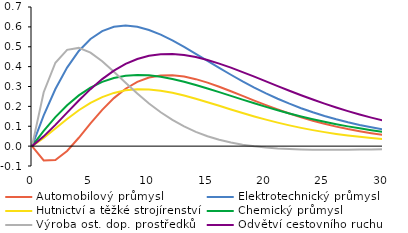
| Category | Automobilový průmysl | Elektrotechnický průmysl | Hutnictví a těžké strojírenství | Chemický průmysl | Výroba ost. dop. prostředků | Odvětví cestovního ruchu |
|---|---|---|---|---|---|---|
| 0.0 | 0 | 0 | 0 | 0 | 0 | 0 |
| 1.0 | -0.072 | 0.155 | 0.041 | 0.077 | 0.271 | 0.049 |
| 2.0 | -0.069 | 0.287 | 0.089 | 0.146 | 0.42 | 0.107 |
| 3.0 | -0.024 | 0.395 | 0.137 | 0.206 | 0.484 | 0.169 |
| 4.0 | 0.042 | 0.479 | 0.18 | 0.255 | 0.494 | 0.23 |
| 5.0 | 0.114 | 0.539 | 0.218 | 0.294 | 0.47 | 0.287 |
| 6.0 | 0.182 | 0.579 | 0.247 | 0.323 | 0.427 | 0.337 |
| 7.0 | 0.242 | 0.601 | 0.268 | 0.343 | 0.374 | 0.38 |
| 8.0 | 0.289 | 0.607 | 0.281 | 0.354 | 0.318 | 0.414 |
| 9.0 | 0.323 | 0.601 | 0.286 | 0.358 | 0.265 | 0.438 |
| 10.0 | 0.345 | 0.584 | 0.285 | 0.356 | 0.215 | 0.455 |
| 11.0 | 0.356 | 0.561 | 0.279 | 0.349 | 0.17 | 0.463 |
| 12.0 | 0.357 | 0.532 | 0.268 | 0.338 | 0.132 | 0.464 |
| 13.0 | 0.35 | 0.499 | 0.255 | 0.324 | 0.099 | 0.458 |
| 14.0 | 0.337 | 0.464 | 0.239 | 0.308 | 0.072 | 0.448 |
| 15.0 | 0.319 | 0.429 | 0.221 | 0.29 | 0.05 | 0.433 |
| 16.0 | 0.299 | 0.394 | 0.203 | 0.272 | 0.032 | 0.415 |
| 17.0 | 0.276 | 0.359 | 0.185 | 0.253 | 0.018 | 0.395 |
| 18.0 | 0.253 | 0.326 | 0.167 | 0.234 | 0.007 | 0.373 |
| 19.0 | 0.229 | 0.295 | 0.149 | 0.215 | -0.001 | 0.349 |
| 20.0 | 0.206 | 0.266 | 0.133 | 0.198 | -0.007 | 0.326 |
| 21.0 | 0.184 | 0.238 | 0.118 | 0.181 | -0.012 | 0.302 |
| 22.0 | 0.164 | 0.214 | 0.104 | 0.164 | -0.015 | 0.279 |
| 23.0 | 0.145 | 0.191 | 0.092 | 0.149 | -0.017 | 0.256 |
| 24.0 | 0.128 | 0.17 | 0.081 | 0.135 | -0.018 | 0.234 |
| 25.0 | 0.112 | 0.152 | 0.07 | 0.122 | -0.018 | 0.214 |
| 26.0 | 0.098 | 0.135 | 0.062 | 0.11 | -0.018 | 0.194 |
| 27.0 | 0.086 | 0.12 | 0.054 | 0.099 | -0.018 | 0.176 |
| 28.0 | 0.075 | 0.107 | 0.047 | 0.089 | -0.017 | 0.159 |
| 29.0 | 0.065 | 0.095 | 0.041 | 0.08 | -0.017 | 0.143 |
| 30.0 | 0.057 | 0.084 | 0.036 | 0.072 | -0.016 | 0.129 |